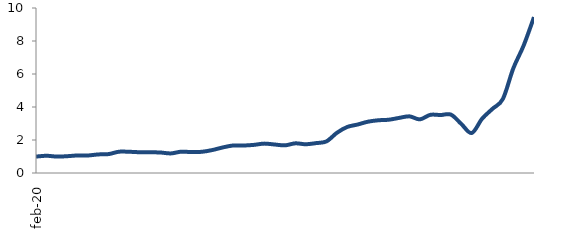
| Category | Series 0 |
|---|---|
| 2020-02-01 | 0.995 |
| 2020-03-01 | 1.044 |
| 2020-04-01 | 0.995 |
| 2020-05-01 | 1.018 |
| 2020-06-01 | 1.063 |
| 2020-07-01 | 1.061 |
| 2020-08-01 | 1.126 |
| 2020-09-01 | 1.146 |
| 2020-10-01 | 1.29 |
| 2020-11-01 | 1.286 |
| 2020-12-01 | 1.258 |
| 2021-01-01 | 1.256 |
| 2021-02-01 | 1.242 |
| 2021-03-01 | 1.187 |
| 2021-04-01 | 1.292 |
| 2021-05-01 | 1.266 |
| 2021-06-01 | 1.285 |
| 2021-07-01 | 1.392 |
| 2021-08-01 | 1.549 |
| 2021-09-01 | 1.667 |
| 2021-10-01 | 1.666 |
| 2021-11-01 | 1.704 |
| 2021-12-01 | 1.78 |
| 2022-01-01 | 1.727 |
| 2022-02-01 | 1.676 |
| 2022-03-01 | 1.798 |
| 2022-04-01 | 1.742 |
| 2022-05-01 | 1.812 |
| 2022-06-01 | 1.917 |
| 2022-07-01 | 2.435 |
| 2022-08-01 | 2.79 |
| 2022-09-01 | 2.938 |
| 2022-10-01 | 3.111 |
| 2022-11-01 | 3.196 |
| 2022-12-01 | 3.228 |
| 2023-01-01 | 3.339 |
| 2023-02-01 | 3.432 |
| 2023-03-01 | 3.25 |
| 2023-04-01 | 3.525 |
| 2023-05-01 | 3.514 |
| 2023-06-01 | 3.536 |
| 2023-07-01 | 2.969 |
| 2023-08-01 | 2.423 |
| 2023-09-01 | 3.292 |
| 2023-10-01 | 3.89 |
| 2023-11-01 | 4.489 |
| 2023-12-01 | 6.336 |
| 2024-01-01 | 7.724 |
| 2024-02-01 | 9.447 |